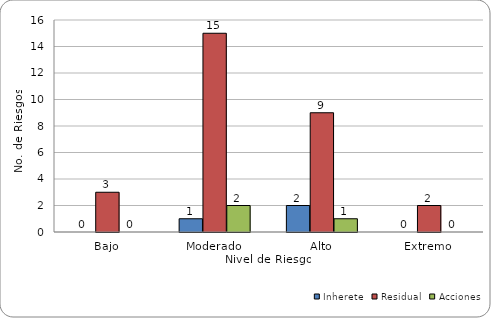
| Category | Inherete | Residual |  Acciones |
|---|---|---|---|
| Bajo | 0 | 3 | 0 |
| Moderado | 1 | 15 | 2 |
| Alto | 2 | 9 | 1 |
| Extremo | 0 | 2 | 0 |